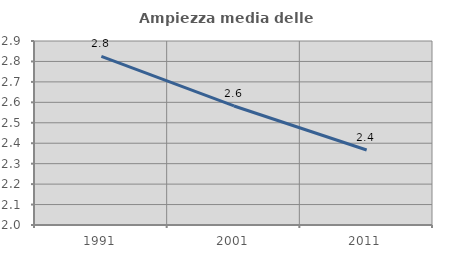
| Category | Ampiezza media delle famiglie |
|---|---|
| 1991.0 | 2.824 |
| 2001.0 | 2.582 |
| 2011.0 | 2.367 |